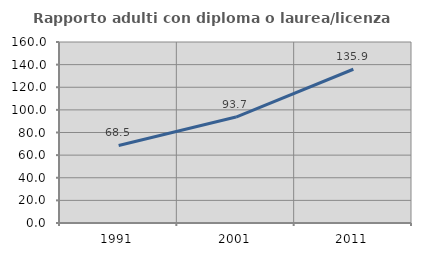
| Category | Rapporto adulti con diploma o laurea/licenza media  |
|---|---|
| 1991.0 | 68.519 |
| 2001.0 | 93.676 |
| 2011.0 | 135.922 |